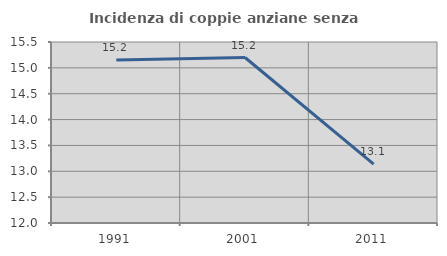
| Category | Incidenza di coppie anziane senza figli  |
|---|---|
| 1991.0 | 15.152 |
| 2001.0 | 15.2 |
| 2011.0 | 13.139 |